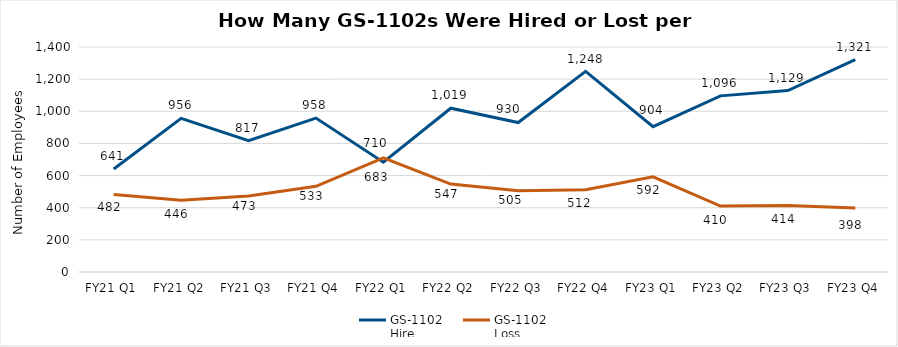
| Category | GS-1102 
Hire | GS-1102 
Loss |
|---|---|---|
| FY21 Q1 | 641 | 482 |
| FY21 Q2 | 956 | 446 |
| FY21 Q3 | 817 | 473 |
| FY21 Q4 | 958 | 533 |
| FY22 Q1 | 683 | 710 |
| FY22 Q2 | 1019 | 547 |
| FY22 Q3 | 930 | 505 |
| FY22 Q4 | 1248 | 512 |
| FY23 Q1 | 904 | 592 |
| FY23 Q2 | 1096 | 410 |
| FY23 Q3 | 1129 | 414 |
| FY23 Q4 | 1321 | 398 |